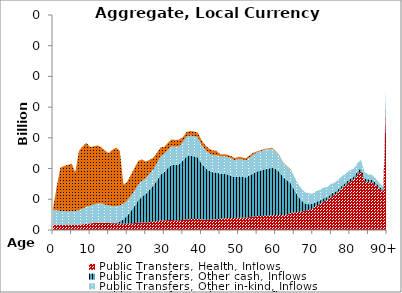
| Category | Public Transfers, Health, Inflows | Public Transfers, Other cash, Inflows | Public Transfers, Other in-kind, Inflows | Public Transfers, Education, Inflows |
|---|---|---|---|---|
| 0 | 0.882 | 0 | 2.412 | 0.167 |
|  | 0.863 | 0 | 2.36 | 3.854 |
| 2 | 0.828 | 0 | 2.266 | 7.066 |
| 3 | 0.823 | 0 | 2.251 | 7.352 |
| 4 | 0.807 | 0 | 2.206 | 7.583 |
| 5 | 0.815 | 0 | 2.231 | 7.767 |
| 6 | 0.824 | 0 | 2.255 | 6.283 |
| 7 | 0.867 | 0 | 2.37 | 9.655 |
| 8 | 0.938 | 0 | 2.561 | 10.113 |
| 9 | 1.022 | 0 | 2.777 | 10.38 |
| 10 | 1.076 | 0 | 2.902 | 9.526 |
| 11 | 1.141 | 0 | 3.046 | 9.436 |
| 12 | 1.179 | 0 | 3.113 | 9.486 |
| 13 | 1.206 | 0 | 3.145 | 9.134 |
| 14 | 1.155 | 0 | 2.976 | 8.812 |
| 15 | 1.141 | 0 | 2.902 | 8.46 |
| 16 | 1.089 | 0.032 | 2.736 | 9.206 |
| 17 | 1.083 | 0.111 | 2.686 | 9.532 |
| 18 | 1.07 | 0.323 | 2.615 | 8.883 |
| 19 | 1.047 | 0.715 | 2.511 | 3.086 |
| 20 | 1.05 | 1.276 | 2.462 | 3.058 |
| 21 | 1.089 | 2.001 | 2.49 | 3.417 |
| 22 | 1.126 | 2.799 | 2.511 | 3.705 |
| 23 | 1.198 | 3.658 | 2.604 | 3.82 |
| 24 | 1.215 | 4.242 | 2.575 | 3.446 |
| 25 | 1.218 | 4.674 | 2.519 | 2.745 |
| 26 | 1.283 | 5.279 | 2.589 | 2.248 |
| 27 | 1.349 | 5.861 | 2.662 | 1.879 |
| 28 | 1.447 | 6.62 | 2.797 | 1.685 |
| 29 | 1.551 | 7.477 | 2.948 | 1.483 |
| 30 | 1.563 | 7.914 | 2.934 | 1.109 |
| 31 | 1.607 | 8.522 | 2.992 | 1.11 |
| 32 | 1.629 | 9.001 | 3.024 | 1.11 |
| 33 | 1.584 | 9.021 | 2.938 | 1.109 |
| 34 | 1.573 | 9.123 | 2.919 | 1.109 |
| 35 | 1.651 | 9.663 | 3.063 | 0.742 |
| 36 | 1.747 | 10.241 | 3.241 | 0.742 |
| 37 | 1.773 | 10.317 | 3.286 | 0.742 |
| 38 | 1.787 | 10.208 | 3.298 | 0.742 |
| 39 | 1.809 | 10.02 | 3.3 | 0.742 |
| 40 | 1.714 | 9.101 | 3.072 | 0.742 |
| 41 | 1.676 | 8.472 | 2.934 | 0.741 |
| 42 | 1.67 | 8.01 | 2.846 | 0.741 |
| 43 | 1.696 | 7.713 | 2.811 | 0.741 |
| 44 | 1.762 | 7.586 | 2.839 | 0.741 |
| 45 | 1.807 | 7.364 | 2.831 | 0.336 |
| 46 | 1.881 | 7.258 | 2.871 | 0.336 |
| 47 | 1.939 | 7.109 | 2.884 | 0.336 |
| 48 | 1.956 | 6.874 | 2.845 | 0.336 |
| 49 | 1.954 | 6.629 | 2.788 | 0.336 |
| 50 | 2.03 | 6.706 | 2.856 | 0.336 |
| 51 | 2.034 | 6.616 | 2.837 | 0.336 |
| 52 | 2.022 | 6.53 | 2.811 | 0.336 |
| 53 | 2.108 | 6.788 | 2.929 | 0.337 |
| 54 | 2.186 | 7.027 | 3.036 | 0.337 |
| 55 | 2.259 | 7.27 | 3.138 | 0.141 |
| 56 | 2.278 | 7.392 | 3.164 | 0.141 |
| 57 | 2.311 | 7.574 | 3.197 | 0.141 |
| 58 | 2.338 | 7.641 | 3.162 | 0.141 |
| 59 | 2.414 | 7.745 | 3.103 | 0.141 |
| 60 | 2.437 | 7.491 | 2.896 | 0.077 |
| 61 | 2.447 | 7.03 | 2.642 | 0.077 |
| 62 | 2.392 | 6.25 | 2.333 | 0.076 |
| 63 | 2.509 | 5.624 | 2.214 | 0.076 |
| 64 | 2.758 | 4.885 | 2.217 | 0.076 |
| 65 | 2.862 | 3.728 | 2.112 | 0 |
| 66 | 2.928 | 2.606 | 1.997 | 0 |
| 67 | 3.041 | 1.727 | 1.925 | 0 |
| 68 | 3.124 | 1.158 | 1.825 | 0 |
| 69 | 3.296 | 0.893 | 1.76 | 0 |
| 70 | 3.514 | 0.739 | 1.705 | 0 |
| 71 | 3.959 | 0.654 | 1.747 | 0 |
| 72 | 4.261 | 0.563 | 1.716 | 0 |
| 73 | 4.68 | 0.508 | 1.717 | 0 |
| 74 | 4.906 | 0.453 | 1.632 | 0 |
| 75 | 5.487 | 0.446 | 1.648 | 0 |
| 76 | 5.763 | 0.42 | 1.564 | 0 |
| 77 | 6.298 | 0.418 | 1.548 | 0 |
| 78 | 6.887 | 0.424 | 1.529 | 0 |
| 79 | 7.35 | 0.428 | 1.471 | 0 |
| 80 | 7.893 | 0.437 | 1.424 | 0 |
| 81 | 8.199 | 0.435 | 1.34 | 0 |
| 82 | 9.039 | 0.466 | 1.346 | 0 |
| 83 | 9.612 | 0.49 | 1.305 | 0 |
| 84 | 7.954 | 0.404 | 0.983 | 0 |
| 85 | 7.842 | 0.401 | 0.882 | 0 |
| 86 | 7.752 | 0.406 | 0.795 | 0 |
| 87 | 7.305 | 0.391 | 0.688 | 0 |
| 88 | 6.679 | 0.363 | 0.582 | 0 |
| 89 | 6.269 | 0.35 | 0.511 | 0 |
| 90+ | 25.461 | 1.792 | 1.714 | 0 |